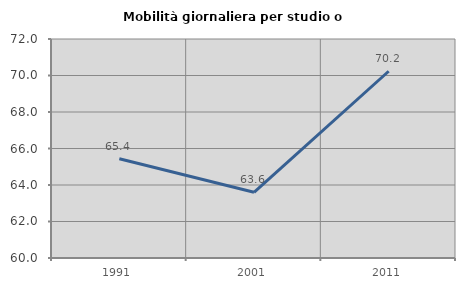
| Category | Mobilità giornaliera per studio o lavoro |
|---|---|
| 1991.0 | 65.435 |
| 2001.0 | 63.6 |
| 2011.0 | 70.233 |